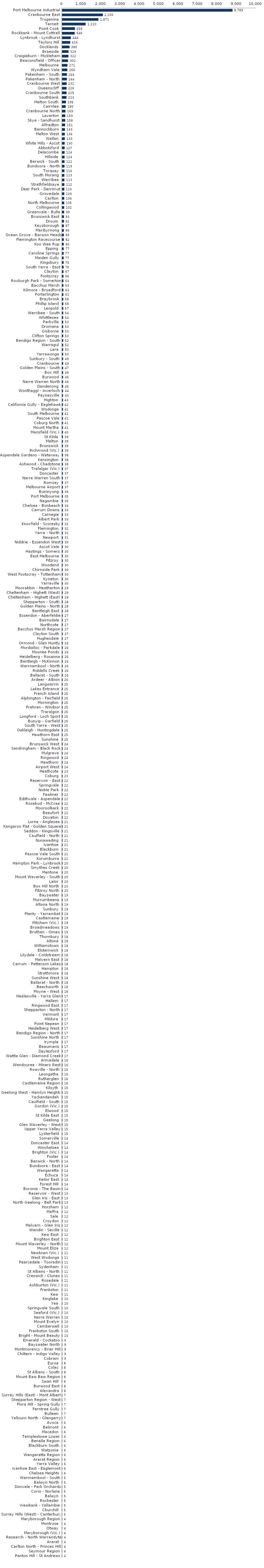
| Category | Series 0 |
|---|---|
| Port Melbourne Industrial | 8788.889 |
| Cranbourne East | 2100.4 |
| Truganina | 1870.672 |
| Tarneit | 1209.861 |
| Point Cook | 658.119 |
| Rockbank - Mount Cottrell | 645.801 |
| Lynbrook - Lyndhurst | 444.337 |
| Taylors Hill | 416.237 |
| Docklands | 379.799 |
| Braeside | 328.571 |
| Craigieburn - Mickleham | 322.223 |
| Beaconsfield - Officer | 302.455 |
| Melbourne | 270.802 |
| Wyndham Vale | 266.427 |
| Pakenham - South | 244.473 |
| Pakenham - North | 243.564 |
| Cranbourne West | 230.664 |
| Queenscliff | 226.126 |
| Cranbourne South | 224.717 |
| Southbank | 222.689 |
| Melton South | 195.31 |
| Cairnlea | 180.171 |
| Cranbourne North | 168.511 |
| Laverton | 159.367 |
| Skye - Sandhurst | 157.977 |
| Alfredton | 150.972 |
| Bannockburn | 142.772 |
| Melton West | 135.636 |
| Wallan | 132.891 |
| White Hills - Ascot | 130.131 |
| Abbotsford | 126.932 |
| Delacombe | 124.121 |
| Hillside | 123.995 |
| Berwick - South | 121.734 |
| Bundoora - North | 119.443 |
| Torquay | 115.916 |
| South Morang | 113.109 |
| Werribee | 112.94 |
| Strathfieldsaye | 111.852 |
| Deer Park - Derrimut | 109.847 |
| Grovedale | 109.059 |
| Carlton | 105.542 |
| North Melbourne | 105.341 |
| Collingwood | 101.803 |
| Greenvale - Bulla | 99.103 |
| Brunswick East | 92.893 |
| Drouin | 91.905 |
| Keysborough | 86.621 |
| Maribyrnong | 86.28 |
| Ocean Grove - Barwon Heads | 85.076 |
| Flemington Racecourse | 82 |
| Koo Wee Rup | 80.17 |
| Epping | 77.306 |
| Caroline Springs | 77.031 |
| Maiden Gully | 76.542 |
| Kingsbury | 76.434 |
| South Yarra - East | 74.76 |
| Clayton | 66.841 |
| Footscray | 65.987 |
| Roxburgh Park - Somerton | 63.315 |
| Bacchus Marsh | 62.791 |
| Kilmore - Broadford | 62.617 |
| Portarlington | 61.457 |
| Braybrook | 58.241 |
| Phillip Island | 57.562 |
| Leopold | 57.058 |
| Werribee - South | 54.149 |
| Whittlesea | 53.789 |
| Parkville | 53.124 |
| Dromana | 53.029 |
| Gisborne | 52.789 |
| Clifton Springs | 52.602 |
| Bendigo Region - South | 52.5 |
| Warragul | 51.986 |
| Lara | 49.785 |
| Yarrawonga | 49.539 |
| Sunbury - South | 49.162 |
| Cranbourne | 49.034 |
| Golden Plains - South | 46.708 |
| Box Hill | 46.226 |
| Burwood | 46.138 |
| Narre Warren North | 45.56 |
| Dandenong | 44.939 |
| Wonthaggi - Inverloch | 43.754 |
| Paynesville | 43.036 |
| Highton | 42.563 |
| California Gully - Eaglehawk | 42.151 |
| Wodonga | 41.474 |
| South Melbourne | 41.461 |
| Pascoe Vale | 41.411 |
| Coburg North | 41.189 |
| Mount Martha | 40.82 |
| Mansfield (Vic.) | 40.011 |
| St Kilda | 38.873 |
| Melton | 38.79 |
| Brunswick | 38.719 |
| Richmond (Vic.) | 38.518 |
| Aspendale Gardens - Waterways | 38.052 |
| Kensington | 37.548 |
| Ashwood - Chadstone | 37.526 |
| Trafalgar (Vic.) | 37.479 |
| Doncaster | 37.485 |
| Narre Warren South | 36.929 |
| Romsey | 36.688 |
| Melbourne Airport | 36.62 |
| Buninyong | 36.441 |
| Port Melbourne | 35.246 |
| Nagambie | 35.006 |
| Chelsea - Bonbeach | 34.215 |
| Carrum Downs | 33.333 |
| Carnegie | 32.955 |
| Albert Park | 32.684 |
| Knoxfield - Scoresby | 31.707 |
| Flemington | 31.536 |
| Yarra - North | 31.38 |
| Newport | 30.886 |
| Niddrie - Essendon West | 30.34 |
| Ascot Vale | 30.229 |
| Hastings - Somers | 30.133 |
| East Melbourne | 30.112 |
| Fitzroy | 29.948 |
| Woodend | 29.795 |
| Chirnside Park | 29.601 |
| West Footscray - Tottenham | 29.568 |
| Kyneton | 29.572 |
| Yarraville | 29.539 |
| Moorabbin - Heatherton | 29.46 |
| Cheltenham - Highett (West) | 29.203 |
| Cheltenham - Highett (East) | 28.057 |
| Shepparton - South | 27.96 |
| Golden Plains - North | 27.918 |
| Bentleigh East | 27.921 |
| Essendon - Aberfeldie | 27.496 |
| Bairnsdale | 27.248 |
| Northcote | 27.055 |
| Bacchus Marsh Region | 26.938 |
| Clayton South | 26.722 |
| Hughesdale | 26.549 |
| Ormond - Glen Huntly | 26.476 |
| Mordialloc - Parkdale | 26.256 |
| Moonee Ponds | 26.228 |
| Heidelberg - Rosanna | 26.13 |
| Bentleigh - McKinnon | 26.105 |
| Warrnambool - North | 25.918 |
| Riddells Creek | 25.746 |
| Ballarat - South | 25.741 |
| Ardeer - Albion | 25.525 |
| Langwarrin | 25.353 |
| Lakes Entrance | 25.335 |
| French Island | 25.275 |
| Alphington - Fairfield | 25.276 |
| Mornington | 25.113 |
| Prahran - Windsor | 24.969 |
| Traralgon | 24.939 |
| Longford - Loch Sport | 24.886 |
| Bunyip - Garfield | 24.887 |
| South Yarra - West | 24.85 |
| Oakleigh - Huntingdale | 24.774 |
| Hawthorn East | 24.592 |
| Sunshine | 24.552 |
| Brunswick West | 24.499 |
| Sandringham - Black Rock | 24.354 |
| Mulgrave | 24.333 |
| Ringwood | 24.169 |
| Hawthorn | 24.16 |
| Airport West | 23.696 |
| Heathcote | 23.292 |
| Coburg | 23.045 |
| Reservoir - East | 22.494 |
| Springvale | 22.381 |
| Noble Park | 22.381 |
| Fawkner | 22.371 |
| Edithvale - Aspendale | 22.225 |
| Rosebud - McCrae | 22.196 |
| Mooroolbark | 21.99 |
| Beaufort | 21.738 |
| Doveton | 21.68 |
| Lorne - Anglesea | 21.491 |
| Kangaroo Flat - Golden Square | 21.394 |
| Seddon - Kingsville | 21.366 |
| Caulfield - North | 21.293 |
| Nunawading | 21.082 |
| Ivanhoe | 21.059 |
| Blackburn | 20.935 |
| Pascoe Vale South | 20.798 |
| Korumburra | 20.542 |
| Hampton Park - Lynbrook | 20.012 |
| Smythes Creek | 19.983 |
| Mentone | 19.863 |
| Mount Waverley - South | 19.857 |
| Lalor | 19.832 |
| Box Hill North | 19.793 |
| Fitzroy North | 19.778 |
| Bayswater | 19.472 |
| Murrumbeena | 19.329 |
| Altona North | 19.348 |
| Sunbury | 19.065 |
| Plenty - Yarrambat | 19.002 |
| Castlemaine | 18.755 |
| Mitcham (Vic.) | 18.668 |
| Broadmeadows | 18.585 |
| Bruthen - Omeo | 18.54 |
| Thornbury | 18.478 |
| Altona | 18.173 |
| Williamstown | 18.105 |
| Elsternwick | 18.126 |
| Lilydale - Coldstream | 18.045 |
| Malvern East | 17.941 |
| Carrum - Patterson Lakes | 17.942 |
| Hampton | 17.91 |
| Strathmore | 17.788 |
| Sunshine West | 17.755 |
| Ballarat - North | 17.714 |
| Beechworth | 17.637 |
| Moyne - West | 17.556 |
| Healesville - Yarra Glen | 17.472 |
| Hallam | 17.428 |
| Ringwood East | 17.349 |
| Shepparton - North | 17.279 |
| Vermont | 17.266 |
| Mildura | 17.095 |
| Point Nepean | 17.088 |
| Heidelberg West | 17.099 |
| Bendigo Region - North | 17.015 |
| Sunshine North | 16.918 |
| Irymple | 16.75 |
| Beaumaris | 16.744 |
| Daylesford | 16.642 |
| Wattle Glen - Diamond Creek | 16.564 |
| Armadale | 16.454 |
| Wendouree - Miners Rest | 16.197 |
| Rowville - North | 16.122 |
| Leongatha | 16.005 |
| Rutherglen | 15.761 |
| Castlemaine Region | 15.709 |
| Kilsyth | 15.362 |
| Geelong West - Hamlyn Heights | 15.279 |
| Yackandandah | 15.206 |
| Caulfield - South | 15.077 |
| Gordon (Vic.) | 14.882 |
| Elwood | 14.727 |
| St Kilda East | 14.656 |
| Geelong | 14.616 |
| Glen Waverley - West | 14.604 |
| Upper Yarra Valley | 14.525 |
| Lysterfield | 14.502 |
| Somerville | 14.379 |
| Doncaster East | 14.327 |
| Winchelsea | 14.041 |
| Brighton (Vic.) | 14.073 |
| Foster | 13.997 |
| Berwick - North | 14 |
| Bundoora - East | 13.944 |
| Wangaratta | 13.875 |
| Echuca | 13.901 |
| Keilor East | 13.729 |
| Forest Hill | 13.727 |
| Boronia - The Basin | 13.559 |
| Reservoir - West | 13.347 |
| Glen Iris - East | 13.338 |
| North Geelong - Bell Park | 13.279 |
| Horsham | 12.431 |
| Maffra | 12.346 |
| Sale | 12.125 |
| Croydon | 12.08 |
| Malvern - Glen Iris | 11.936 |
| Wandin - Seville | 11.808 |
| Kew East | 11.826 |
| Brighton East | 11.831 |
| Mount Waverley - North | 11.644 |
| Mount Eliza | 11.636 |
| Newtown (Vic.) | 11.276 |
| West Wodonga | 11.224 |
| Pearcedale - Tooradin | 11.148 |
| Sydenham | 11.123 |
| St Albans - North | 10.945 |
| Creswick - Clunes | 10.737 |
| Rosedale | 10.625 |
| Ashburton (Vic.) | 10.651 |
| Frankston | 10.556 |
| Kew | 10.525 |
| Kinglake | 10.364 |
| Yea | 10.197 |
| Springvale South | 10.173 |
| Seaford (Vic.) | 10.099 |
| Narre Warren | 9.811 |
| Mount Evelyn | 9.636 |
| Camberwell | 9.516 |
| Frankston South | 9.503 |
| Bright - Mount Beauty | 9.506 |
| Emerald - Cockatoo | 9.087 |
| Bayswater North | 9.028 |
| Montmorency - Briar Hill | 8.915 |
| Chiltern - Indigo Valley | 8.923 |
| Cobram | 8.729 |
| Euroa | 8.489 |
| Colac | 8.394 |
| St Albans - South | 8.341 |
| Mount Baw Baw Region | 8.223 |
| Swan Hill | 7.964 |
| Burwood East | 7.939 |
| Alexandra | 7.503 |
| Surrey Hills (East) - Mont Albert | 7.194 |
| Shepparton Region - West | 7.154 |
| Flora Hill - Spring Gully | 7.075 |
| Ferntree Gully | 7.06 |
| Bulleen | 6.706 |
| Yallourn North - Glengarry | 6.524 |
| Avoca | 6.465 |
| Belmont | 6.439 |
| Macedon | 6.419 |
| Templestowe Lower | 6.229 |
| Benalla Region | 5.892 |
| Blackburn South | 5.87 |
| Watsonia | 5.774 |
| Wangaratta Region | 5.727 |
| Ararat Region | 5.718 |
| Yarra Valley | 5.603 |
| Ivanhoe East - Eaglemont | 5.622 |
| Chelsea Heights | 5.565 |
| Warrnambool - South | 5.308 |
| Balwyn North | 5.319 |
| Donvale - Park Orchards | 5.178 |
| Corio - Norlane | 5.038 |
| Balwyn | 5.006 |
| Rochester | 4.907 |
| Viewbank - Yallambie | 4.829 |
| Churchill | 4.808 |
| Surrey Hills (West) - Canterbury | 4.621 |
| Maryborough Region | 4.481 |
| Montrose | 4.304 |
| Otway | 4.272 |
| Maryborough (Vic.) | 4.234 |
| Research - North Warrandyte | 4.203 |
| Ararat | 4.227 |
| Carlton North - Princes Hill | 4.055 |
| Seymour Region | 3.757 |
| Panton Hill - St Andrews | 3.758 |